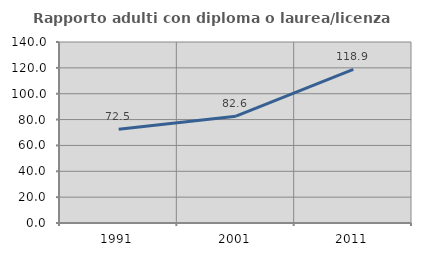
| Category | Rapporto adulti con diploma o laurea/licenza media  |
|---|---|
| 1991.0 | 72.509 |
| 2001.0 | 82.598 |
| 2011.0 | 118.892 |